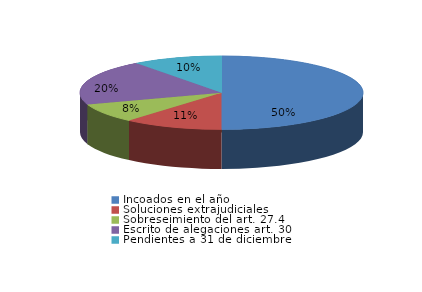
| Category | Series 0 |
|---|---|
| Incoados en el año | 415 |
| Soluciones extrajudiciales | 94 |
| Sobreseimiento del art. 27.4 | 70 |
| Escrito de alegaciones art. 30 | 166 |
| Pendientes a 31 de diciembre | 85 |